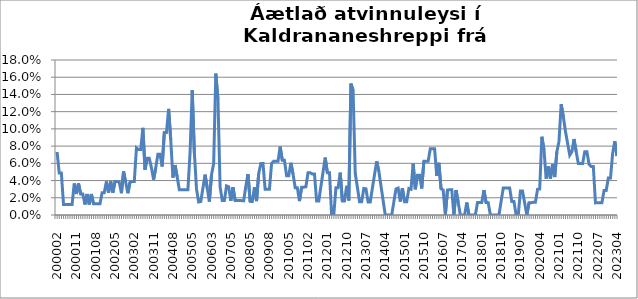
| Category | Series 0 |
|---|---|
| 200002 | 0.073 |
| 200003 | 0.049 |
| 200004 | 0.049 |
| 200005 | 0.012 |
| 200006 | 0.012 |
| 200007 | 0.012 |
| 200008 | 0.012 |
| 200009 | 0.012 |
| 200010 | 0.037 |
| 200011 | 0.024 |
| 200012 | 0.037 |
| 200101 | 0.024 |
| 200102 | 0.024 |
| 200103 | 0.012 |
| 200104 | 0.024 |
| 200105 | 0.012 |
| 200106 | 0.024 |
| 200107 | 0.013 |
| 200108 | 0.013 |
| 200109 | 0.013 |
| 200110 | 0.013 |
| 200111 | 0.026 |
| 200112 | 0.026 |
| 200201 | 0.039 |
| 200202 | 0.026 |
| 200203 | 0.039 |
| 200204 | 0.026 |
| 200205 | 0.039 |
| 200206 | 0.039 |
| 200207 | 0.038 |
| 200208 | 0.025 |
| 200209 | 0.051 |
| 200210 | 0.038 |
| 200211 | 0.025 |
| 200212 | 0.038 |
| 200301 | 0.039 |
| 200302 | 0.039 |
| 200303 | 0.078 |
| 200304 | 0.076 |
| 200305 | 0.076 |
| 200306 | 0.101 |
| 200307 | 0.053 |
| 200308 | 0.066 |
| 200309 | 0.066 |
| 200310 | 0.055 |
| 200311 | 0.041 |
| 200312 | 0.055 |
| 200401 | 0.07 |
| 200402 | 0.07 |
| 200403 | 0.056 |
| 200404 | 0.096 |
| 200405 | 0.096 |
| 200406 | 0.123 |
| 200407 | 0.087 |
| 200408 | 0.043 |
| 200409 | 0.058 |
| 200410 | 0.044 |
| 200411 | 0.029 |
| 200412 | 0.029 |
| 200501 | 0.029 |
| 200502 | 0.029 |
| 200503 | 0.029 |
| 200504 | 0.072 |
| 200505 | 0.145 |
| 200506 | 0.072 |
| 200508 | 0.03 |
| 200509 | 0.015 |
| 200510 | 0.016 |
| 200511 | 0.031 |
| 200512 | 0.047 |
| 200601 | 0.031 |
| 200602 | 0.016 |
| 200603 | 0.047 |
| 200604 | 0.06 |
| 200605 | 0.164 |
| 200606 | 0.134 |
| 200609 | 0.033 |
| 200610 | 0.017 |
| 200702 | 0.017 |
| 200703 | 0.034 |
| 200704 | 0.033 |
| 200705 | 0.016 |
| 200709 | 0.032 |
| 200710 | 0.017 |
| 200711 | 0.017 |
| 200712 | 0.017 |
| 200801 | 0.017 |
| 200802 | 0.017 |
| 200803 | 0.033 |
| 200804 | 0.048 |
| 200805 | 0.016 |
| 200812 | 0.016 |
| 200901 | 0.032 |
| 200902 | 0.016 |
| 200903 | 0.048 |
| 200904 | 0.06 |
| 200905 | 0.06 |
| 200906 | 0.03 |
| 200907 | 0.03 |
| 200908 | 0.03 |
| 200909 | 0.06 |
| 200910 | 0.062 |
| 200911 | 0.062 |
| 200912 | 0.062 |
| 201001 | 0.079 |
| 201002 | 0.063 |
| 201003 | 0.063 |
| 201004 | 0.045 |
| 201005 | 0.045 |
| 201006 | 0.061 |
| 201007 | 0.048 |
| 201008 | 0.032 |
| 201009 | 0.032 |
| 201010 | 0.016 |
| 201011 | 0.032 |
| 201012 | 0.032 |
| 201101 | 0.033 |
| 201102 | 0.049 |
| 201103 | 0.049 |
| 201104 | 0.048 |
| 201105 | 0.048 |
| 201108 | 0.016 |
| 201109 | 0.016 |
| 201110 | 0.033 |
| 201111 | 0.05 |
| 201112 | 0.067 |
| 201201 | 0.049 |
| 201202 | 0.049 |
| 201203 | 0 |
| 201204 | 0 |
| 201205 | 0.032 |
| 201206 | 0.032 |
| 201207 | 0.049 |
| 201208 | 0.016 |
| 201209 | 0.016 |
| 201210 | 0.034 |
| 201211 | 0.017 |
| 201212 | 0.153 |
| 201301 | 0.145 |
| 201302 | 0.048 |
| 201303 | 0.032 |
| 201304 | 0.015 |
| 201305 | 0.015 |
| 201306 | 0.031 |
| 201307 | 0.03 |
| 201308 | 0.015 |
| 201309 | 0.015 |
| 201310 | 0.031 |
| 201311 | 0.047 |
| 201312 | 0.062 |
| 201401 | 0.051 |
| 201402 | 0.034 |
| 201403 | 0.017 |
| 201404 | 0 |
| 201405 | 0 |
| 201406 | 0 |
| 201407 | 0 |
| 201408 | 0.015 |
| 201409 | 0.03 |
| 201410 | 0.031 |
| 201411 | 0.016 |
| 201412 | 0.031 |
| 201501 | 0.015 |
| 201502 | 0.015 |
| 201503 | 0.031 |
| 201504 | 0.03 |
| 201505 | 0.06 |
| 201506 | 0.03 |
| 201507 | 0.046 |
| 201508 | 0.046 |
| 201509 | 0.031 |
| 201510 | 0.062 |
| 201511 | 0.062 |
| 201512 | 0.062 |
| 201601 | 0.077 |
| 201602 | 0.077 |
| 201603 | 0.077 |
| 201604 | 0.045 |
| 201605 | 0.061 |
| 201606 | 0.03 |
| 201607 | 0.029 |
| 201608 | 0 |
| 201609 | 0.029 |
| 201610 | 0.029 |
| 201611 | 0.029 |
| 201612 | 0 |
| 201701 | 0.029 |
| 201702 | 0.014 |
| 201703 | 0 |
| 201704 | 0 |
| 201705 | 0 |
| 201706 | 0.014 |
| 201707 | 0 |
| 201708 | 0 |
| 201709 | 0 |
| 201710 | 0 |
| 201711 | 0.014 |
| 201712 | 0.014 |
| 201801 | 0.014 |
| 201802 | 0.029 |
| 201803 | 0.014 |
| 201804 | 0.014 |
| 201805 | 0 |
| 201806 | 0 |
| 201807 | 0 |
| 201808 | 0 |
| 201809 | 0 |
| 201810 | 0.016 |
| 201811 | 0.031 |
| 201812 | 0.031 |
| 201901 | 0.031 |
| 201902 | 0.031 |
| 201903 | 0.016 |
| 201904 | 0.016 |
| 201905 | 0 |
| 201906 | 0 |
| 201907 | 0.028 |
| 201908 | 0.028 |
| 201909 | 0.014 |
| 201910 | 0 |
| 201911 | 0.014 |
| 201912 | 0.014 |
| 202001 | 0.015 |
| 202002 | 0.015 |
| 202003 | 0.03 |
| 202004 | 0.03 |
| 202005 | 0.091 |
| 202006 | 0.076 |
| 202007 | 0.042 |
| 202008 | 0.056 |
| 202009 | 0.042 |
| 202010 | 0.059 |
| 202011 | 0.044 |
| 202012 | 0.074 |
| 202101 | 0.086 |
| 202102 | 0.129 |
| 202103 | 0.114 |
| 202104 | 0.097 |
| 202105 | 0.083 |
| 202106 | 0.069 |
| 202107 | 0.074 |
| 202108 | 0.088 |
| 202109 | 0.074 |
| 202110 | 0.06 |
| 202111 | 0.06 |
| 202112 | 0.06 |
| 202201 | 0.074 |
| 202202 | 0.074 |
| 202203 | 0.059 |
| 202204 | 0.056 |
| 202205 | 0.056 |
| 202206 | 0.014 |
| 202207 | 0.014 |
| 202208 | 0.014 |
| 202209 | 0.014 |
| 202210 | 0.029 |
| 202211 | 0.029 |
| 202212 | 0.043 |
| 202301 | 0.043 |
| 202302 | 0.071 |
| 202303 | 0.086 |
| 202304 | 0.068 |